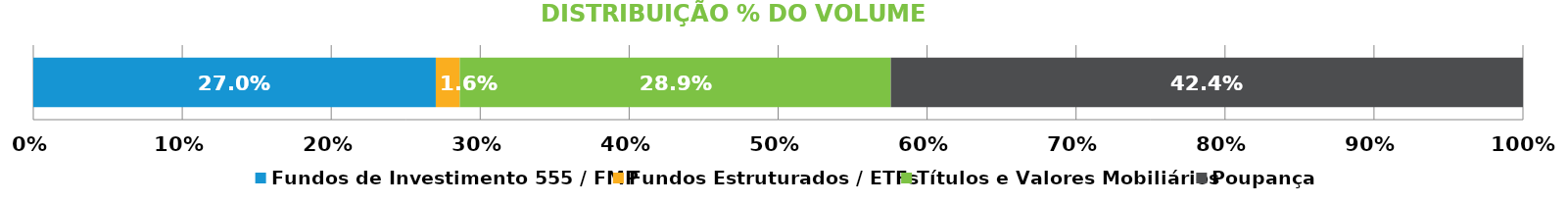
| Category | Fundos de Investimento 555 / FMP | Fundos Estruturados / ETFs | Títulos e Valores Mobiliários | Poupança |
|---|---|---|---|---|
| 0 | 0.27 | 0.016 | 0.289 | 0.424 |